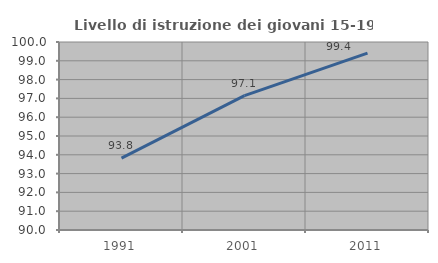
| Category | Livello di istruzione dei giovani 15-19 anni |
|---|---|
| 1991.0 | 93.824 |
| 2001.0 | 97.147 |
| 2011.0 | 99.412 |